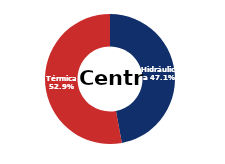
| Category | Centro |
|---|---|
| Eólica | 0 |
| Hidráulica | 1775.316 |
| Solar | 0 |
| Térmica | 1995.541 |